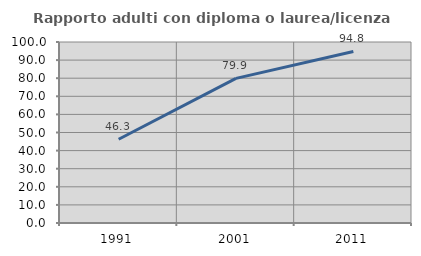
| Category | Rapporto adulti con diploma o laurea/licenza media  |
|---|---|
| 1991.0 | 46.275 |
| 2001.0 | 79.9 |
| 2011.0 | 94.793 |